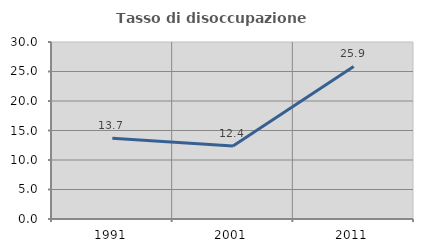
| Category | Tasso di disoccupazione giovanile  |
|---|---|
| 1991.0 | 13.699 |
| 2001.0 | 12.371 |
| 2011.0 | 25.862 |